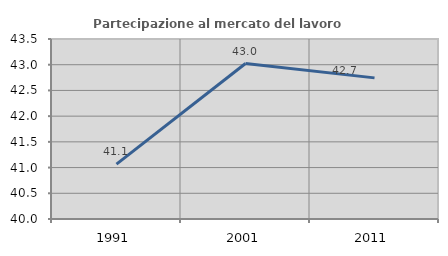
| Category | Partecipazione al mercato del lavoro  femminile |
|---|---|
| 1991.0 | 41.066 |
| 2001.0 | 43.023 |
| 2011.0 | 42.744 |